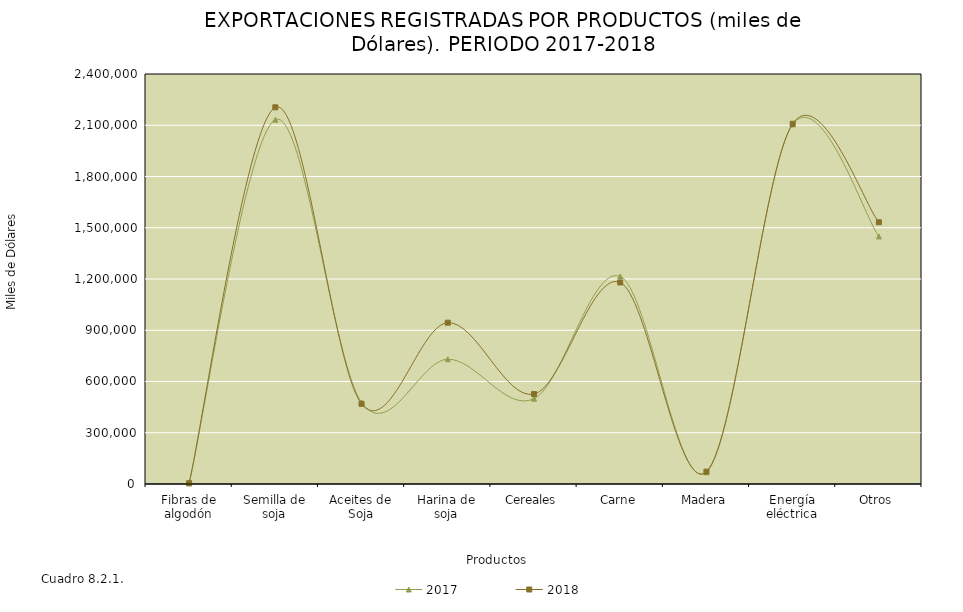
| Category | 2017 | 2018 |
|---|---|---|
| Fibras de algodón | 3574.624 | 4844.794 |
| Semilla de soja | 2132416.623 | 2205038.913 |
| Aceites de Soja | 477129.927 | 469237.596 |
| Harina de soja | 730287 | 944331.639 |
| Cereales | 499181.499 | 526306.523 |
| Carne | 1215033 | 1179563.675 |
| Madera | 68549.862 | 72269.331 |
| Energía eléctrica | 2104509.852 | 2108641.674 |
| Otros | 1449150.655 | 1532235.329 |